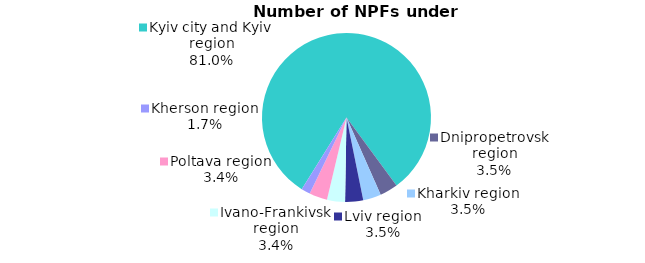
| Category | Series 0 |
|---|---|
| Kyiv city and Kyiv region | 0.81 |
| Dnipropetrovsk region | 0.034 |
| Kharkiv region | 0.034 |
| Lviv region | 0.034 |
| Ivano-Frankivsk region | 0.034 |
| Poltava region | 0.034 |
| Kherson region | 0.017 |